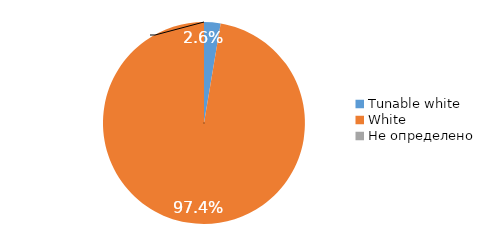
| Category | Series 0 |
|---|---|
| Tunable white | 0.026 |
| White | 0.974 |
| Не определено | 0 |